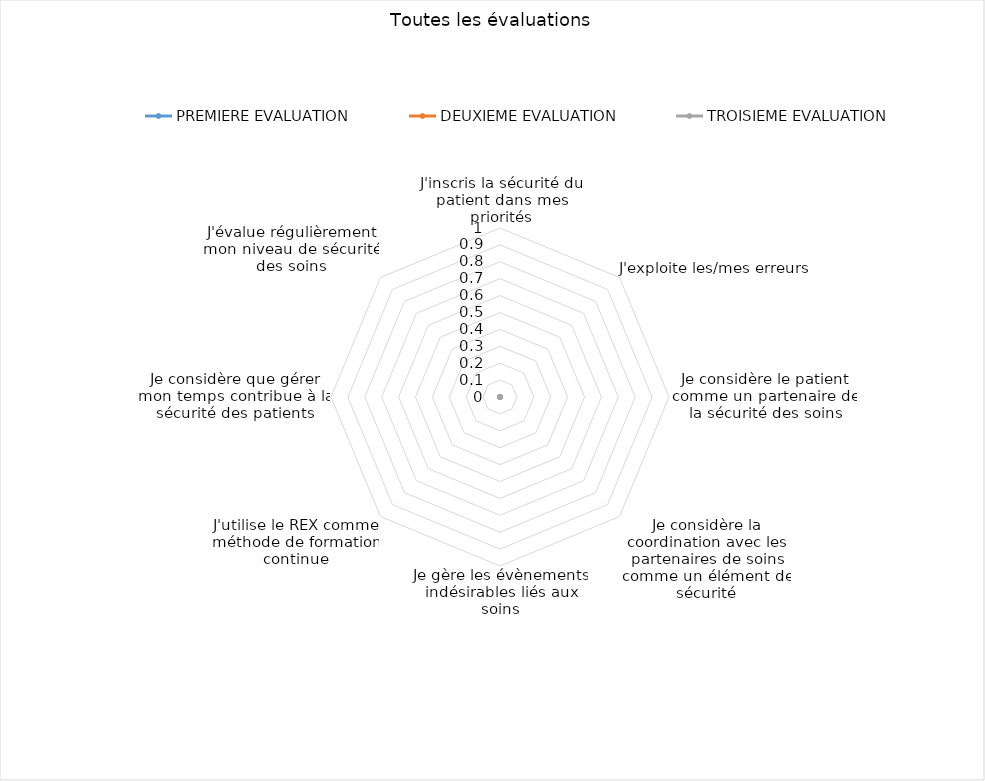
| Category | PREMIERE EVALUATION | DEUXIEME EVALUATION | TROISIEME EVALUATION |
|---|---|---|---|
| 0 | 0 | 0 | 0 |
| 1 | 0 | 0 | 0 |
| 2 | 0 | 0 | 0 |
| 3 | 0 | 0 | 0 |
| 4 | 0 | 0 | 0 |
| 5 | 0 | 0 | 0 |
| 6 | 0 | 0 | 0 |
| 7 | 0 | 0 | 0 |